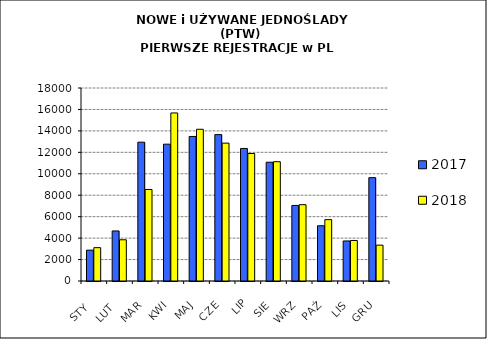
| Category | 2017 | 2018 |
|---|---|---|
|  STY  | 2878 | 3111 |
|  LUT  | 4668 | 3845 |
| MAR | 12947 | 8538 |
| KWI | 12761 | 15674 |
| MAJ | 13480 | 14150 |
| CZE | 13652 | 12858 |
| LIP | 12361 | 11890 |
| SIE | 11077 | 11127 |
| WRZ | 7046 | 7118 |
| PAŹ | 5152 | 5724 |
| LIS | 3734 | 3780 |
| GRU | 9637 | 3343 |